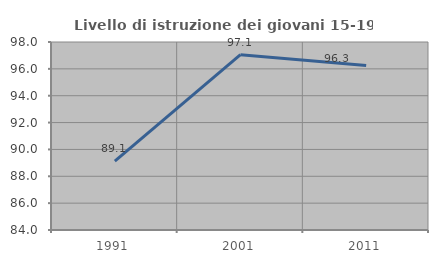
| Category | Livello di istruzione dei giovani 15-19 anni |
|---|---|
| 1991.0 | 89.13 |
| 2001.0 | 97.059 |
| 2011.0 | 96.25 |